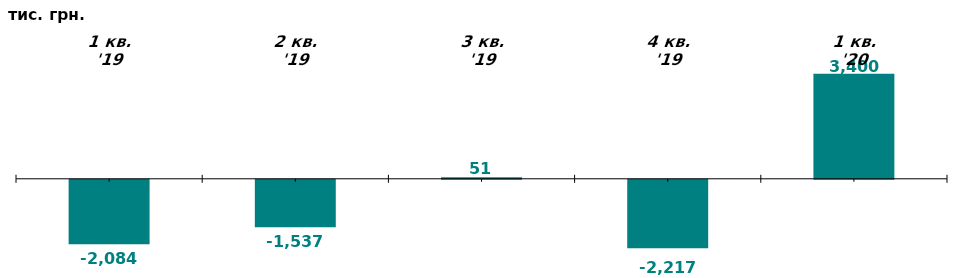
| Category | Чистий притік/відтік капіталу у 1-му кв. 2019-20 рр., тис. грн. |
|---|---|
| 1 кв. '19 | -2083.653 |
| 2 кв. '19 | -1537.385 |
| 3 кв. '19 | 50.954 |
| 4 кв. '19 | -2216.998 |
| 1 кв. '20 | 3400.023 |